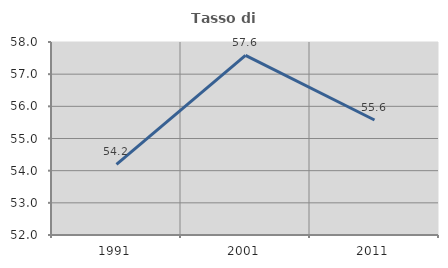
| Category | Tasso di occupazione   |
|---|---|
| 1991.0 | 54.198 |
| 2001.0 | 57.584 |
| 2011.0 | 55.575 |